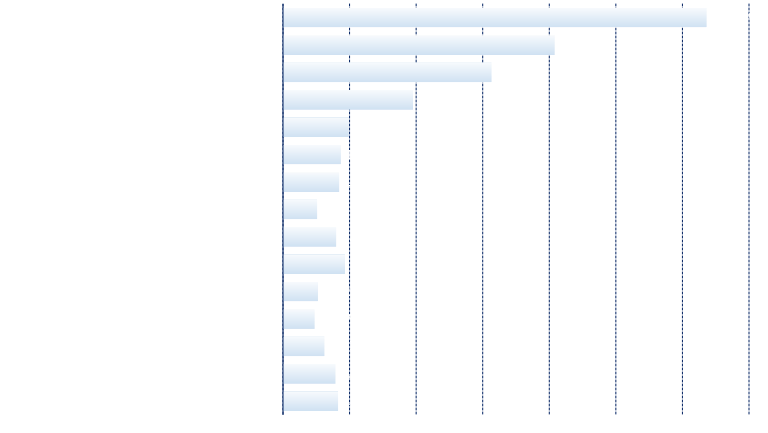
| Category | Series 0 |
|---|---|
| Newell Brands Inc. | 0.127 |
| Kate Spade Company | 0.081 |
| COACH INC | 0.062 |
| Varian Medical Systems Inc | 0.039 |
| United Rentals Inc | 0.019 |
| Texas Capital Bancshares Inc | 0.017 |
| QEP Resources, Inc. | 0.017 |
| Carlisle Cos Inc | 0.01 |
| Murphy Oil Corp | 0.016 |
| Chesapeake Energy Corp | 0.018 |
| Pioneer Natural Resources | 0.01 |
| L Brands, Inc. | 0.009 |
| Newfield Exploration Co | 0.012 |
| Xilinx Inc | 0.015 |
| TripAdvisor, Inc. | 0.016 |